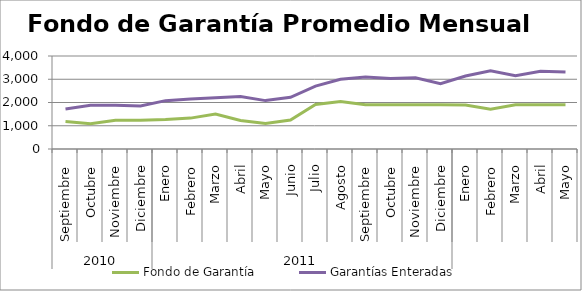
| Category | Fondo de Garantía | Garantías Enteradas |
|---|---|---|
| 0 | 1186.765 | 1723.136 |
| 1 | 1091.277 | 1878.561 |
| 2 | 1240.142 | 1886.493 |
| 3 | 1233.184 | 1848.941 |
| 4 | 1267.175 | 2079.773 |
| 5 | 1328.315 | 2151.804 |
| 6 | 1507.218 | 2200.488 |
| 7 | 1222.61 | 2253.818 |
| 8 | 1097.438 | 2081.441 |
| 9 | 1248.758 | 2223.666 |
| 10 | 1917.982 | 2706.525 |
| 11 | 2038.339 | 3002.384 |
| 12 | 1900.513 | 3095.395 |
| 13 | 1900.513 | 3029.373 |
| 14 | 1900.513 | 3060.179 |
| 15 | 1900.513 | 2809.042 |
| 16 | 1896.798 | 3141.641 |
| 17 | 1714.423 | 3362.648 |
| 18 | 1900.513 | 3154.118 |
| 19 | 1900.513 | 3348.058 |
| 20 | 1898.685 | 3308.859 |